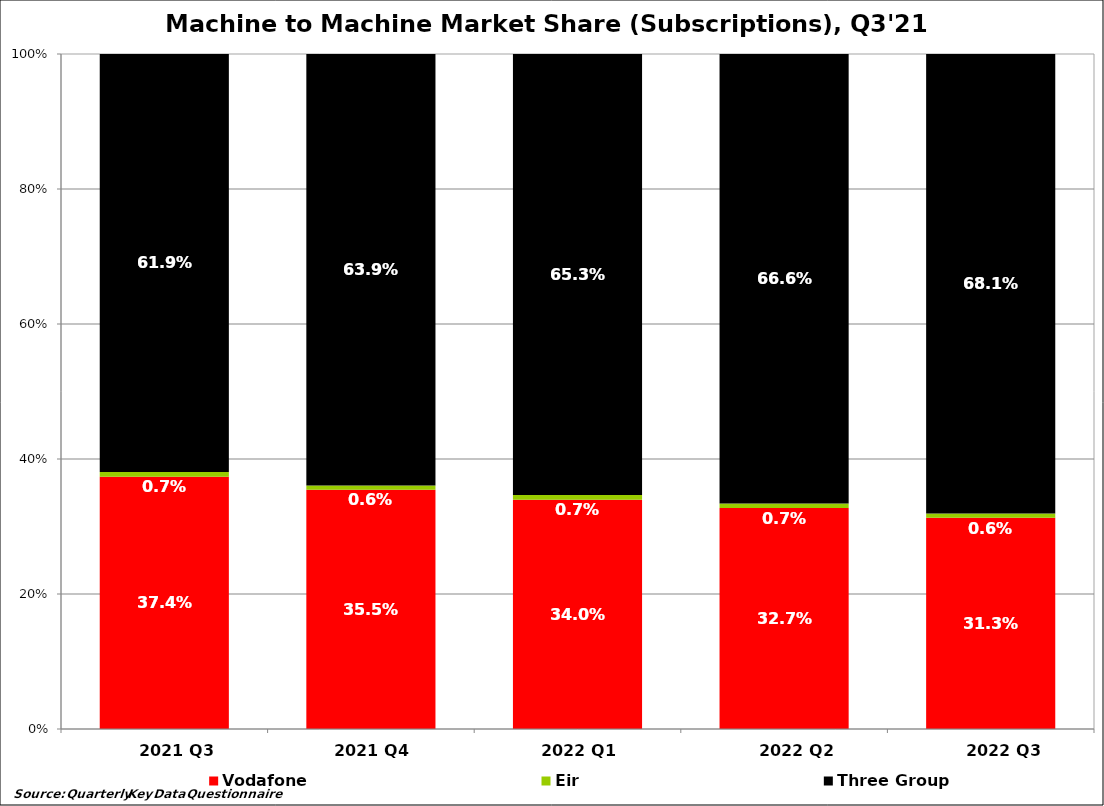
| Category | Vodafone | Eir  | Three Group |
|---|---|---|---|
| 2021 Q3 | 0.374 | 0.007 | 0.619 |
| 2021 Q4  | 0.355 | 0.006 | 0.639 |
| 2022 Q1  | 0.34 | 0.007 | 0.653 |
| 2022 Q2 | 0.327 | 0.007 | 0.666 |
| 2022 Q3 | 0.313 | 0.006 | 0.681 |